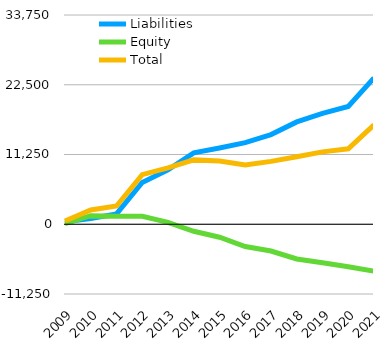
| Category | Liabilities  | Equity  | Total |
|---|---|---|---|
| 2009 | 412 | 104 | 516 |
| 2010 | 915 | 1388 | 2303 |
| 2011 | 1665.4 | 1274 | 2939.4 |
| 2012 | 6730.4 | 1274 | 8004.4 |
| 2013 | 8782.4 | 304 | 9086.4 |
| 2014 | 11518.4 | -1137 | 10381.4 |
| 2015 | 12301.4 | -2089 | 10212.4 |
| 2016 | 13155.4 | -3599 | 9556.4 |
| 2017 | 14462.4 | -4320 | 10142.4 |
| 2018 | 16504.4 | -5604 | 10900.4 |
| 2019 | 17897.4 | -6224 | 11673.4 |
| 2020 | 19003.4 | -6841 | 12162.4 |
| 2021 | 23582.4 | -7554 | 16028.4 |